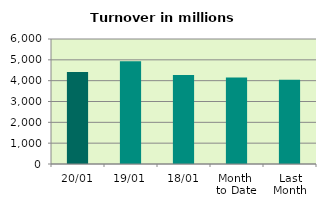
| Category | Series 0 |
|---|---|
| 20/01 | 4415.165 |
| 19/01 | 4932.345 |
| 18/01 | 4276.193 |
| Month 
to Date | 4147.945 |
| Last
Month | 4039.067 |